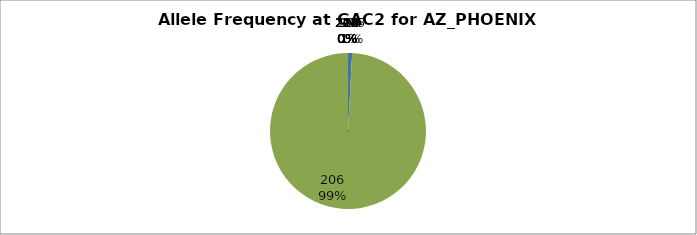
| Category | Series 0 |
|---|---|
| 204.0 | 0.009 |
| 205.0 | 0 |
| 206.0 | 0.991 |
| 209.0 | 0 |
| 216.0 | 0 |
| 218.0 | 0 |
| 220.0 | 0 |
| 222.0 | 0 |
| 224.0 | 0 |
| 226.0 | 0 |
| 228.0 | 0 |